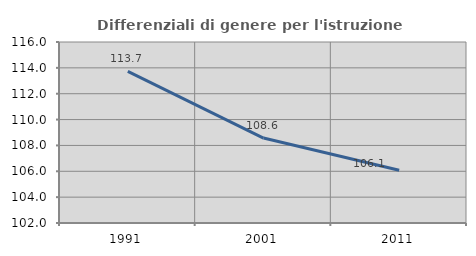
| Category | Differenziali di genere per l'istruzione superiore |
|---|---|
| 1991.0 | 113.733 |
| 2001.0 | 108.568 |
| 2011.0 | 106.08 |